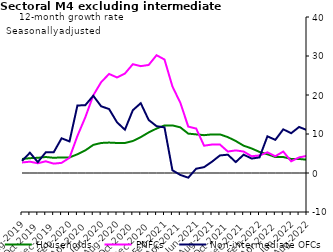
| Category | zero | Households | PNFCs | Non-intermediate OFCs |
|---|---|---|---|---|
| Aug-2019 | 0 | 3.6 | 2.7 | 3.1 |
| Sep-2019 | 0 | 3.8 | 2.9 | 5.2 |
| Oct-2019 | 0 | 3.9 | 2.5 | 2.8 |
| Nov-2019 | 0 | 4.1 | 3 | 5.3 |
| Dec-2019 | 0 | 3.9 | 2.4 | 5.3 |
| Jan-2020 | 0 | 4 | 2.6 | 8.9 |
| Feb-2020 | 0 | 4 | 3.9 | 8.1 |
| Mar-2020 | 0 | 4.8 | 9.5 | 17.3 |
| Apr-2020 | 0 | 5.8 | 14.3 | 17.4 |
| May-2020 | 0 | 7.2 | 19.9 | 19.8 |
| Jun-2020 | 0 | 7.7 | 23.3 | 17.1 |
| Jul-2020 | 0 | 7.8 | 25.4 | 16.4 |
| Aug-2020 | 0 | 7.7 | 24.5 | 13 |
| Sep-2020 | 0 | 7.7 | 25.5 | 11.1 |
| Oct-2020 | 0 | 8.2 | 27.9 | 16.1 |
| Nov-2020 | 0 | 9.2 | 27.4 | 17.9 |
| Dec-2020 | 0 | 10.4 | 27.7 | 13.6 |
| Jan-2021 | 0 | 11.4 | 30.2 | 12 |
| Feb-2021 | 0 | 12.2 | 29.1 | 11.7 |
| Mar-2021 | 0 | 12.2 | 22.2 | 0.7 |
| Apr-2021 | 0 | 11.7 | 18 | -0.5 |
| May-2021 | 0 | 10.1 | 11.9 | -1.2 |
| Jun-2021 | 0 | 9.9 | 11.4 | 1.1 |
| Jul-2021 | 0 | 9.7 | 7 | 1.5 |
| Aug-2021 | 0 | 9.9 | 7.3 | 2.9 |
| Sep-2021 | 0 | 9.9 | 7.3 | 4.5 |
| Oct-2021 | 0 | 9.2 | 5.5 | 4.7 |
| Nov-2021 | 0 | 8.2 | 5.8 | 2.8 |
| Dec-2021 | 0 | 7 | 5.5 | 4.7 |
| Jan-2022 | 0 | 6.3 | 4.3 | 3.7 |
| Feb-2022 | 0 | 5.4 | 4.5 | 4 |
| Mar-2022 | 0 | 4.8 | 5.3 | 9.4 |
| Apr-2022 | 0 | 4.1 | 4.3 | 8.5 |
| May-2022 | 0 | 4.1 | 5.5 | 11.2 |
| Jun-2022 | 0 | 3.6 | 3 | 10.2 |
| Jul-2022 | 0 | 3.6 | 4 | 11.8 |
| Aug-2022 | 0 | 3.4 | 4.4 | 11 |